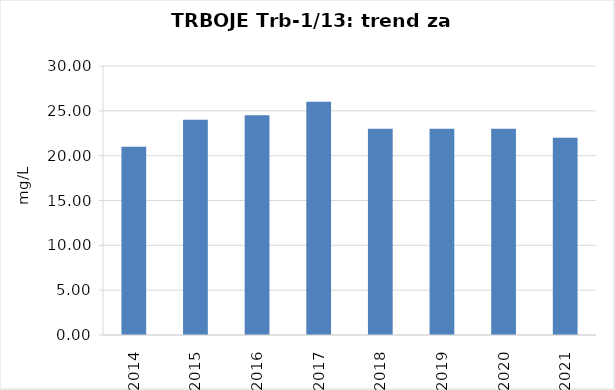
| Category | Vsota |
|---|---|
| 2014 | 21 |
| 2015 | 24 |
| 2016 | 24.5 |
| 2017 | 26 |
| 2018 | 23 |
| 2019 | 23 |
| 2020 | 23 |
| 2021 | 22 |